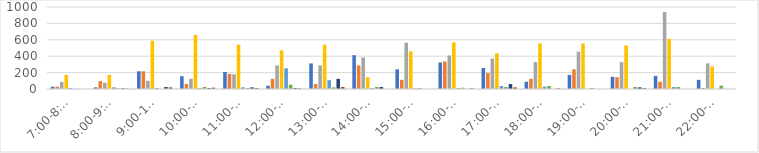
| Category | Series 0 | Series 1 | Series 2 | Series 3 | Series 4 | Series 5 | Series 6 | Series 7 |
|---|---|---|---|---|---|---|---|---|
| 7:00-8:00 | 28 | 28 | 88 | 172 | 12 | 0 | 0 | 0 |
| 8:00-9:00 | 20 | 96 | 76 | 172 | 20 | 8 | 8 | 4 |
| 9:00-10:00 | 216 | 216 | 100 | 588 | 12 | 0 | 24 | 20 |
| 10:00-11:00 | 156 | 60 | 124 | 660 | 12 | 24 | 12 | 16 |
| 11:00-12:00 | 208 | 184 | 180 | 540 | 20 | 12 | 20 | 12 |
| 12:00-13:00 | 40 | 124 | 288 | 472 | 252 | 52 | 12 | 8 |
| 13:00-14:00 | 312 | 60 | 288 | 540 | 108 | 20 | 124 | 24 |
| 14:00-15:00 | 412 | 288 | 384 | 144 | 12 | 24 | 24 | 0 |
| 15:00-16:00 | 240 | 112 | 564 | 460 | 8 | 12 | 0 | 0 |
| 16:00-17:00 | 324 | 336 | 408 | 568 | 12 | 16 | 0 | 8 |
| 17:00-18:00 | 256 | 196 | 372 | 436 | 36 | 24 | 60 | 20 |
| 18:00-19:00 | 88 | 124 | 328 | 556 | 28 | 36 | 0 | 8 |
| 19:00-20:00 | 172 | 240 | 456 | 556 | 0 | 12 | 0 | 0 |
| 20:00-21:00 | 148 | 144 | 328 | 532 | 0 | 24 | 20 | 12 |
| 21:00-22:00 | 160 | 88 | 940 | 612 | 24 | 24 | 0 | 0 |
| 22:00-23:00 | 112 | 12 | 312 | 276 | 0 | 40 | 0 | 0 |